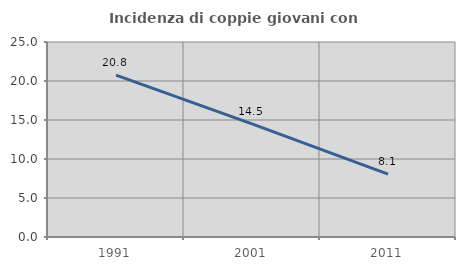
| Category | Incidenza di coppie giovani con figli |
|---|---|
| 1991.0 | 20.758 |
| 2001.0 | 14.51 |
| 2011.0 | 8.072 |